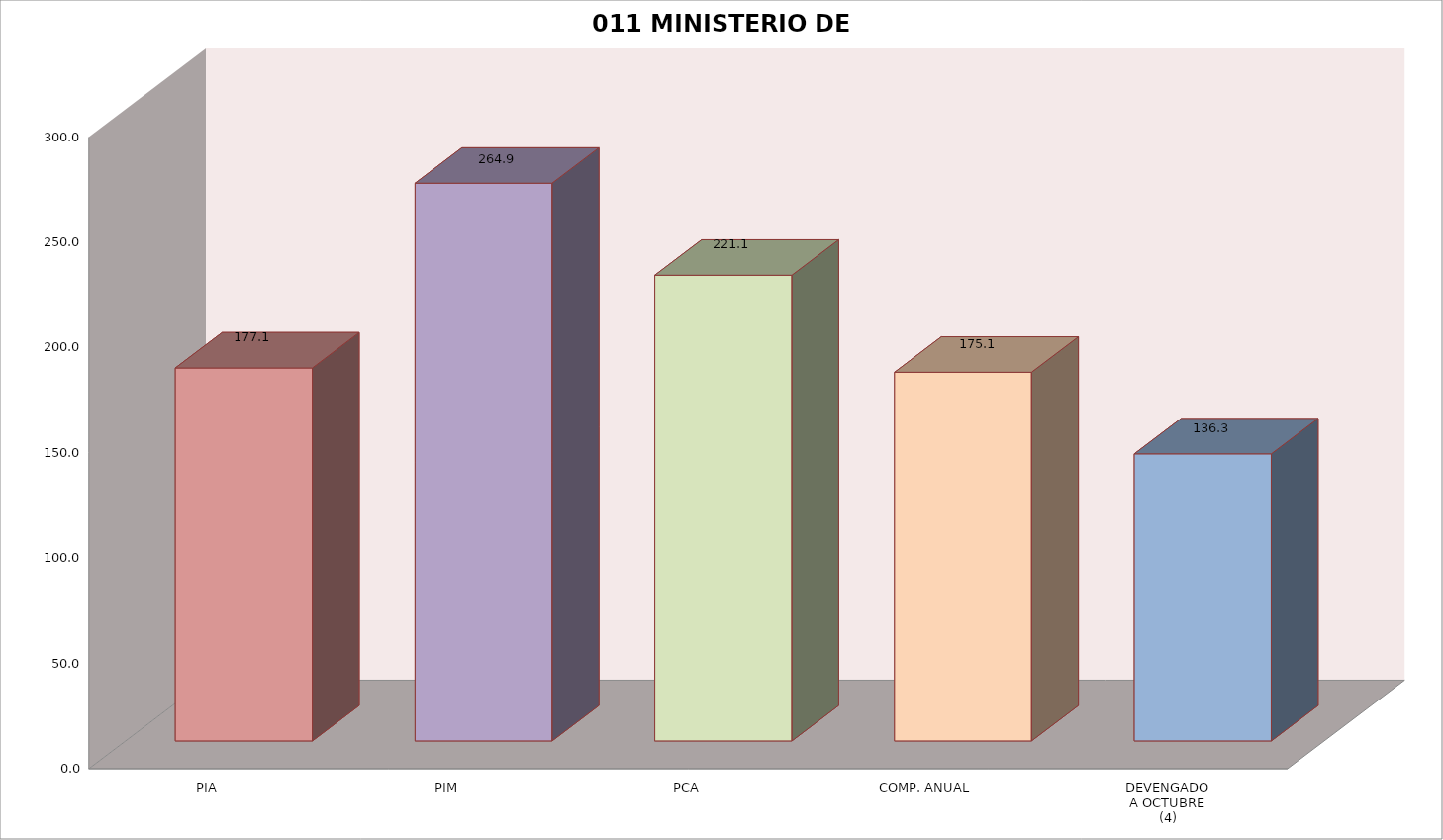
| Category | 011 MINISTERIO DE SALUD |
|---|---|
| PIA | 177.09 |
| PIM | 264.874 |
| PCA | 221.136 |
| COMP. ANUAL | 175.061 |
| DEVENGADO
A OCTUBRE
(4) | 136.314 |